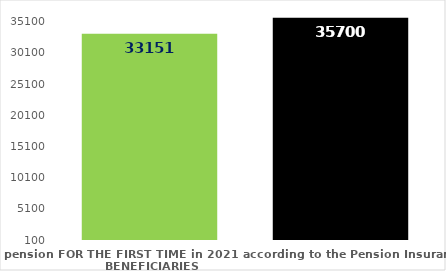
| Category | broj korisnika |
|---|---|
| Pension beneficiaries entitled to pension FOR THE FIRST TIME in 2021 according to the Pension Insurance Act  - NEW BENEFICIARIES | 33151 |
| Pension beneficiaries whose pension entitlement ceased in 2021  -  death caused,   
and who were retired according to the Pension Insurance Act   | 35700 |